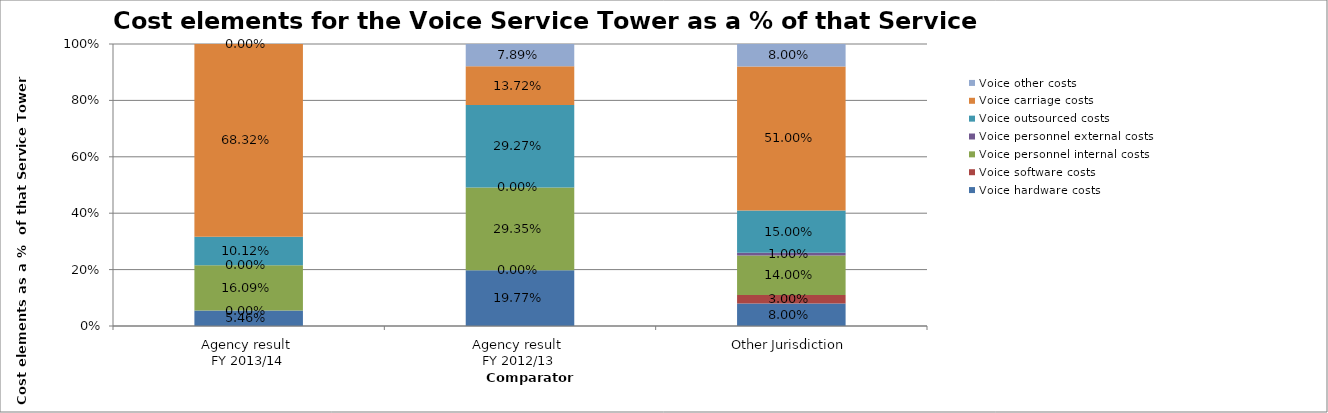
| Category | Voice hardware costs | Voice software costs | Voice personnel internal costs | Voice personnel external costs | Voice outsourced costs | Voice carriage costs | Voice other costs |
|---|---|---|---|---|---|---|---|
| Agency result 
FY 2013/14 | 0.055 | 0 | 0.161 | 0 | 0.101 | 0.683 | 0 |
| Agency result 
FY 2012/13 | 0.198 | 0 | 0.294 | 0 | 0.293 | 0.137 | 0.079 |
| Other Jurisdiction | 0.08 | 0.03 | 0.14 | 0.01 | 0.15 | 0.51 | 0.08 |